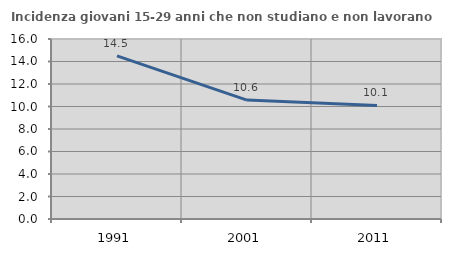
| Category | Incidenza giovani 15-29 anni che non studiano e non lavorano  |
|---|---|
| 1991.0 | 14.498 |
| 2001.0 | 10.569 |
| 2011.0 | 10.092 |